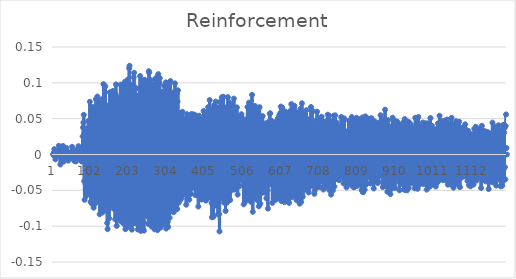
| Category | Reinforcement |
|---|---|
| 0 | 0 |
| 1 | 0.002 |
| 2 | -0.001 |
| 3 | 0.007 |
| 4 | -0.002 |
| 5 | 0 |
| 6 | -0.007 |
| 7 | 0.005 |
| 8 | 0.005 |
| 9 | 0.004 |
| 10 | 0.003 |
| 11 | 0.001 |
| 12 | 0.003 |
| 13 | 0.005 |
| 14 | 0.001 |
| 15 | 0.012 |
| 16 | -0.001 |
| 17 | -0.002 |
| 18 | 0.006 |
| 19 | -0.014 |
| 20 | -0.005 |
| 21 | 0.003 |
| 22 | -0.01 |
| 23 | -0.002 |
| 24 | 0.004 |
| 25 | -0.006 |
| 26 | 0.012 |
| 27 | 0.001 |
| 28 | -0.01 |
| 29 | 0.001 |
| 30 | -0.006 |
| 31 | 0.004 |
| 32 | -0.003 |
| 33 | 0.004 |
| 34 | -0.005 |
| 35 | 0.009 |
| 36 | -0.003 |
| 37 | -0.005 |
| 38 | 0.004 |
| 39 | 0.003 |
| 40 | -0.009 |
| 41 | 0.001 |
| 42 | -0.002 |
| 43 | 0.001 |
| 44 | 0.002 |
| 45 | -0.005 |
| 46 | -0.005 |
| 47 | 0 |
| 48 | 0 |
| 49 | 0.003 |
| 50 | 0.011 |
| 51 | 0.006 |
| 52 | -0.004 |
| 53 | -0.004 |
| 54 | -0.005 |
| 55 | 0.003 |
| 56 | -0.009 |
| 57 | 0.006 |
| 58 | -0.003 |
| 59 | 0.004 |
| 60 | -0.01 |
| 61 | -0.002 |
| 62 | -0.004 |
| 63 | 0.002 |
| 64 | -0.003 |
| 65 | 0.004 |
| 66 | 0.001 |
| 67 | 0.012 |
| 68 | 0.009 |
| 69 | -0.002 |
| 70 | 0.006 |
| 71 | 0.004 |
| 72 | -0.001 |
| 73 | 0.005 |
| 74 | -0.008 |
| 75 | -0.01 |
| 76 | -0.009 |
| 77 | 0.004 |
| 78 | 0.025 |
| 79 | 0.038 |
| 80 | 0.045 |
| 81 | 0.055 |
| 82 | -0.037 |
| 83 | -0.063 |
| 84 | 0.009 |
| 85 | 0.03 |
| 86 | -0.042 |
| 87 | -0.058 |
| 88 | 0.012 |
| 89 | 0.036 |
| 90 | -0.04 |
| 91 | -0.052 |
| 92 | 0.019 |
| 93 | 0.047 |
| 94 | -0.035 |
| 95 | -0.054 |
| 96 | 0.03 |
| 97 | 0.074 |
| 98 | -0.029 |
| 99 | -0.066 |
| 100 | 0.003 |
| 101 | 0.062 |
| 102 | 0.061 |
| 103 | -0.069 |
| 104 | -0.022 |
| 105 | 0.066 |
| 106 | 0.046 |
| 107 | -0.074 |
| 108 | -0.044 |
| 109 | 0.056 |
| 110 | 0.03 |
| 111 | -0.069 |
| 112 | -0.039 |
| 113 | 0.077 |
| 114 | 0.021 |
| 115 | -0.066 |
| 116 | -0.051 |
| 117 | 0.081 |
| 118 | 0.034 |
| 119 | -0.064 |
| 120 | -0.028 |
| 121 | 0.075 |
| 122 | 0.033 |
| 123 | -0.083 |
| 124 | -0.065 |
| 125 | 0.07 |
| 126 | 0.074 |
| 127 | -0.078 |
| 128 | -0.079 |
| 129 | 0.077 |
| 130 | 0.053 |
| 131 | -0.081 |
| 132 | -0.077 |
| 133 | 0.098 |
| 134 | 0.065 |
| 135 | -0.073 |
| 136 | -0.065 |
| 137 | 0.087 |
| 138 | 0.095 |
| 139 | -0.076 |
| 140 | 0.016 |
| 141 | 0.069 |
| 142 | 0.067 |
| 143 | -0.096 |
| 144 | -0.104 |
| 145 | 0.067 |
| 146 | 0.063 |
| 147 | -0.077 |
| 148 | -0.089 |
| 149 | 0.067 |
| 150 | 0.087 |
| 151 | -0.065 |
| 152 | -0.071 |
| 153 | 0.086 |
| 154 | -0.042 |
| 155 | -0.057 |
| 156 | -0.067 |
| 157 | 0.084 |
| 158 | 0.089 |
| 159 | -0.063 |
| 160 | -0.076 |
| 161 | 0.077 |
| 162 | 0.082 |
| 163 | -0.076 |
| 164 | -0.09 |
| 165 | 0.084 |
| 166 | 0.098 |
| 167 | -0.073 |
| 168 | -0.1 |
| 169 | 0.065 |
| 170 | 0.079 |
| 171 | -0.083 |
| 172 | -0.079 |
| 173 | 0.068 |
| 174 | 0.077 |
| 175 | -0.084 |
| 176 | -0.091 |
| 177 | 0.079 |
| 178 | 0.097 |
| 179 | -0.082 |
| 180 | -0.094 |
| 181 | 0.06 |
| 182 | 0.097 |
| 183 | -0.077 |
| 184 | -0.087 |
| 185 | 0.078 |
| 186 | 0.094 |
| 187 | -0.097 |
| 188 | -0.095 |
| 189 | 0.081 |
| 190 | 0.102 |
| 191 | -0.104 |
| 192 | -0.086 |
| 193 | 0.064 |
| 194 | 0.08 |
| 195 | -0.102 |
| 196 | -0.1 |
| 197 | 0.074 |
| 198 | 0.105 |
| 199 | -0.092 |
| 200 | -0.095 |
| 201 | 0.12 |
| 202 | 0.124 |
| 203 | -0.07 |
| 204 | -0.094 |
| 205 | 0.07 |
| 206 | 0.094 |
| 207 | -0.098 |
| 208 | -0.105 |
| 209 | 0.096 |
| 210 | 0.098 |
| 211 | -0.085 |
| 212 | -0.096 |
| 213 | 0.108 |
| 214 | 0.114 |
| 215 | -0.066 |
| 216 | -0.084 |
| 217 | 0.08 |
| 218 | 0.093 |
| 219 | -0.085 |
| 220 | -0.093 |
| 221 | 0.058 |
| 222 | 0.063 |
| 223 | -0.098 |
| 224 | -0.105 |
| 225 | 0.067 |
| 226 | 0.082 |
| 227 | -0.086 |
| 228 | -0.091 |
| 229 | 0.091 |
| 230 | 0.109 |
| 231 | -0.078 |
| 232 | -0.107 |
| 233 | 0.092 |
| 234 | 0.094 |
| 235 | -0.084 |
| 236 | -0.092 |
| 237 | 0.093 |
| 238 | 0.103 |
| 239 | -0.094 |
| 240 | -0.106 |
| 241 | 0.084 |
| 242 | 0.104 |
| 243 | -0.084 |
| 244 | -0.077 |
| 245 | 0.094 |
| 246 | 0.1 |
| 247 | -0.081 |
| 248 | -0.086 |
| 249 | 0.102 |
| 250 | 0.094 |
| 251 | -0.074 |
| 252 | -0.097 |
| 253 | 0.116 |
| 254 | 0.114 |
| 255 | -0.077 |
| 256 | -0.095 |
| 257 | 0.104 |
| 258 | 0.103 |
| 259 | -0.089 |
| 260 | -0.1 |
| 261 | 0.089 |
| 262 | 0.097 |
| 263 | -0.089 |
| 264 | -0.09 |
| 265 | 0.086 |
| 266 | 0.097 |
| 267 | -0.093 |
| 268 | -0.104 |
| 269 | 0.075 |
| 270 | 0.106 |
| 271 | -0.075 |
| 272 | -0.089 |
| 273 | 0.09 |
| 274 | 0.108 |
| 275 | -0.088 |
| 276 | -0.106 |
| 277 | 0.094 |
| 278 | 0.112 |
| 279 | -0.084 |
| 280 | -0.099 |
| 281 | 0.1 |
| 282 | 0.107 |
| 283 | -0.081 |
| 284 | -0.102 |
| 285 | 0.068 |
| 286 | 0.087 |
| 287 | -0.098 |
| 288 | -0.093 |
| 289 | 0.081 |
| 290 | 0.087 |
| 291 | -0.091 |
| 292 | -0.095 |
| 293 | 0.078 |
| 294 | 0.096 |
| 295 | -0.088 |
| 296 | -0.094 |
| 297 | 0.076 |
| 298 | 0.101 |
| 299 | -0.103 |
| 300 | -0.095 |
| 301 | 0.077 |
| 302 | 0.1 |
| 303 | -0.094 |
| 304 | -0.101 |
| 305 | 0.079 |
| 306 | 0.095 |
| 307 | -0.077 |
| 308 | -0.088 |
| 309 | 0.073 |
| 310 | 0.103 |
| 311 | -0.075 |
| 312 | -0.079 |
| 313 | 0.059 |
| 314 | 0.076 |
| 315 | -0.071 |
| 316 | -0.072 |
| 317 | 0.062 |
| 318 | 0.086 |
| 319 | -0.08 |
| 320 | -0.074 |
| 321 | 0.057 |
| 322 | 0.099 |
| 323 | -0.066 |
| 324 | -0.066 |
| 325 | 0.067 |
| 326 | 0.085 |
| 327 | -0.061 |
| 328 | -0.076 |
| 329 | 0.074 |
| 330 | 0.09 |
| 331 | -0.048 |
| 332 | -0.067 |
| 333 | 0.051 |
| 334 | 0.056 |
| 335 | -0.056 |
| 336 | -0.064 |
| 337 | 0.058 |
| 338 | 0.053 |
| 339 | -0.061 |
| 340 | -0.057 |
| 341 | 0.03 |
| 342 | 0.06 |
| 343 | -0.05 |
| 344 | -0.056 |
| 345 | 0.037 |
| 346 | 0.042 |
| 347 | -0.037 |
| 348 | -0.048 |
| 349 | 0.046 |
| 350 | 0.051 |
| 351 | -0.053 |
| 352 | -0.07 |
| 353 | 0.046 |
| 354 | 0.056 |
| 355 | -0.05 |
| 356 | -0.057 |
| 357 | 0.045 |
| 358 | 0.046 |
| 359 | -0.051 |
| 360 | -0.063 |
| 361 | 0.029 |
| 362 | 0.039 |
| 363 | -0.044 |
| 364 | -0.055 |
| 365 | 0.051 |
| 366 | 0.057 |
| 367 | -0.018 |
| 368 | -0.046 |
| 369 | 0.055 |
| 370 | 0.056 |
| 371 | -0.023 |
| 372 | -0.046 |
| 373 | 0.046 |
| 374 | 0.056 |
| 375 | -0.026 |
| 376 | -0.057 |
| 377 | 0.037 |
| 378 | 0.054 |
| 379 | -0.036 |
| 380 | -0.056 |
| 381 | 0.041 |
| 382 | 0.032 |
| 383 | -0.038 |
| 384 | -0.073 |
| 385 | 0.05 |
| 386 | 0.054 |
| 387 | -0.051 |
| 388 | -0.059 |
| 389 | 0.044 |
| 390 | 0.047 |
| 391 | -0.043 |
| 392 | -0.063 |
| 393 | 0.029 |
| 394 | 0.029 |
| 395 | -0.056 |
| 396 | -0.062 |
| 397 | 0.05 |
| 398 | 0.061 |
| 399 | -0.046 |
| 400 | -0.054 |
| 401 | 0.043 |
| 402 | 0.058 |
| 403 | -0.035 |
| 404 | -0.064 |
| 405 | 0.025 |
| 406 | 0.049 |
| 407 | -0.051 |
| 408 | -0.061 |
| 409 | 0.043 |
| 410 | 0.066 |
| 411 | -0.045 |
| 412 | -0.06 |
| 413 | 0.058 |
| 414 | 0.076 |
| 415 | -0.034 |
| 416 | -0.056 |
| 417 | 0.055 |
| 418 | 0.059 |
| 419 | -0.068 |
| 420 | -0.088 |
| 421 | 0.043 |
| 422 | 0.063 |
| 423 | -0.06 |
| 424 | -0.087 |
| 425 | 0.053 |
| 426 | 0.069 |
| 427 | -0.052 |
| 428 | -0.071 |
| 429 | 0.05 |
| 430 | 0.074 |
| 431 | -0.034 |
| 432 | -0.066 |
| 433 | 0.052 |
| 434 | 0.065 |
| 435 | -0.056 |
| 436 | -0.083 |
| 437 | 0.045 |
| 438 | 0.057 |
| 439 | -0.083 |
| 440 | -0.107 |
| 441 | 0.062 |
| 442 | 0.074 |
| 443 | -0.048 |
| 444 | -0.05 |
| 445 | 0.071 |
| 446 | 0.08 |
| 447 | -0.036 |
| 448 | -0.061 |
| 449 | 0.056 |
| 450 | 0.08 |
| 451 | -0.045 |
| 452 | -0.067 |
| 453 | 0.054 |
| 454 | 0.061 |
| 455 | -0.052 |
| 456 | -0.079 |
| 457 | 0.037 |
| 458 | 0.066 |
| 459 | -0.055 |
| 460 | -0.067 |
| 461 | 0.049 |
| 462 | 0.08 |
| 463 | -0.054 |
| 464 | -0.056 |
| 465 | 0.052 |
| 466 | 0.073 |
| 467 | -0.044 |
| 468 | -0.064 |
| 469 | 0.044 |
| 470 | 0.068 |
| 471 | -0.039 |
| 472 | -0.05 |
| 473 | 0.042 |
| 474 | 0.07 |
| 475 | -0.042 |
| 476 | -0.038 |
| 477 | 0.062 |
| 478 | 0.078 |
| 479 | -0.049 |
| 480 | -0.048 |
| 481 | 0.042 |
| 482 | 0.048 |
| 483 | -0.038 |
| 484 | -0.046 |
| 485 | 0.049 |
| 486 | 0.066 |
| 487 | -0.043 |
| 488 | -0.056 |
| 489 | 0.03 |
| 490 | 0.042 |
| 491 | -0.044 |
| 492 | -0.044 |
| 493 | 0.027 |
| 494 | 0.053 |
| 495 | -0.016 |
| 496 | -0.035 |
| 497 | 0.054 |
| 498 | 0.056 |
| 499 | -0.025 |
| 500 | -0.029 |
| 501 | 0.047 |
| 502 | 0.046 |
| 503 | -0.043 |
| 504 | -0.07 |
| 505 | 0.032 |
| 506 | 0.049 |
| 507 | -0.061 |
| 508 | -0.066 |
| 509 | 0.03 |
| 510 | 0.04 |
| 511 | -0.046 |
| 512 | -0.046 |
| 513 | 0.046 |
| 514 | 0.066 |
| 515 | -0.052 |
| 516 | -0.058 |
| 517 | 0.045 |
| 518 | 0.072 |
| 519 | -0.047 |
| 520 | -0.063 |
| 521 | 0.058 |
| 522 | 0.063 |
| 523 | -0.054 |
| 524 | -0.067 |
| 525 | 0.06 |
| 526 | 0.083 |
| 527 | -0.063 |
| 528 | -0.08 |
| 529 | 0.048 |
| 530 | 0.062 |
| 531 | -0.043 |
| 532 | -0.06 |
| 533 | 0.059 |
| 534 | 0.068 |
| 535 | -0.034 |
| 536 | -0.046 |
| 537 | 0.057 |
| 538 | 0.064 |
| 539 | -0.042 |
| 540 | -0.064 |
| 541 | 0.048 |
| 542 | 0.049 |
| 543 | -0.051 |
| 544 | -0.072 |
| 545 | 0.047 |
| 546 | 0.066 |
| 547 | -0.044 |
| 548 | -0.069 |
| 549 | 0.046 |
| 550 | 0.046 |
| 551 | -0.028 |
| 552 | -0.054 |
| 553 | 0.042 |
| 554 | 0.054 |
| 555 | -0.03 |
| 556 | -0.053 |
| 557 | 0.035 |
| 558 | 0.042 |
| 559 | -0.032 |
| 560 | -0.05 |
| 561 | 0.043 |
| 562 | 0.043 |
| 563 | -0.044 |
| 564 | -0.061 |
| 565 | 0.033 |
| 566 | 0.044 |
| 567 | -0.05 |
| 568 | -0.075 |
| 569 | 0.034 |
| 570 | 0.045 |
| 571 | -0.027 |
| 572 | -0.042 |
| 573 | 0.057 |
| 574 | 0.058 |
| 575 | -0.014 |
| 576 | -0.03 |
| 577 | 0.038 |
| 578 | 0.047 |
| 579 | -0.04 |
| 580 | -0.067 |
| 581 | 0.027 |
| 582 | 0.041 |
| 583 | -0.042 |
| 584 | -0.06 |
| 585 | 0.043 |
| 586 | 0.033 |
| 587 | -0.04 |
| 588 | -0.063 |
| 589 | 0.043 |
| 590 | 0.045 |
| 591 | -0.036 |
| 592 | -0.05 |
| 593 | 0.048 |
| 594 | 0.05 |
| 595 | -0.035 |
| 596 | -0.061 |
| 597 | 0.038 |
| 598 | 0.055 |
| 599 | -0.034 |
| 600 | -0.062 |
| 601 | 0.058 |
| 602 | 0.067 |
| 603 | -0.044 |
| 604 | -0.065 |
| 605 | 0.041 |
| 606 | 0.065 |
| 607 | -0.046 |
| 608 | -0.059 |
| 609 | 0.049 |
| 610 | 0.06 |
| 611 | -0.053 |
| 612 | -0.066 |
| 613 | 0.051 |
| 614 | 0.06 |
| 615 | -0.053 |
| 616 | -0.059 |
| 617 | 0.037 |
| 618 | 0.053 |
| 619 | -0.041 |
| 620 | -0.065 |
| 621 | 0.047 |
| 622 | 0.056 |
| 623 | -0.057 |
| 624 | -0.068 |
| 625 | 0.041 |
| 626 | 0.06 |
| 627 | -0.052 |
| 628 | -0.058 |
| 629 | 0.038 |
| 630 | 0.07 |
| 631 | -0.042 |
| 632 | -0.06 |
| 633 | 0.039 |
| 634 | 0.064 |
| 635 | -0.036 |
| 636 | -0.057 |
| 637 | 0.065 |
| 638 | 0.068 |
| 639 | -0.036 |
| 640 | -0.055 |
| 641 | 0.039 |
| 642 | 0.059 |
| 643 | -0.058 |
| 644 | -0.064 |
| 645 | 0.035 |
| 646 | 0.053 |
| 647 | -0.055 |
| 648 | -0.059 |
| 649 | 0.05 |
| 650 | 0.059 |
| 651 | -0.056 |
| 652 | -0.069 |
| 653 | 0.052 |
| 654 | 0.064 |
| 655 | -0.054 |
| 656 | -0.066 |
| 657 | 0.059 |
| 658 | 0.071 |
| 659 | -0.055 |
| 660 | -0.059 |
| 661 | 0.052 |
| 662 | 0.057 |
| 663 | -0.042 |
| 664 | -0.049 |
| 665 | 0.042 |
| 666 | 0.048 |
| 667 | -0.039 |
| 668 | -0.044 |
| 669 | 0.038 |
| 670 | 0.062 |
| 671 | -0.049 |
| 672 | -0.047 |
| 673 | 0.047 |
| 674 | 0.049 |
| 675 | -0.047 |
| 676 | -0.053 |
| 677 | 0.027 |
| 678 | 0.047 |
| 679 | -0.032 |
| 680 | -0.029 |
| 681 | 0.04 |
| 682 | 0.066 |
| 683 | -0.044 |
| 684 | -0.032 |
| 685 | 0.061 |
| 686 | 0.06 |
| 687 | -0.042 |
| 688 | -0.043 |
| 689 | 0.032 |
| 690 | 0.033 |
| 691 | -0.055 |
| 692 | -0.05 |
| 693 | 0.024 |
| 694 | 0.047 |
| 695 | -0.047 |
| 696 | -0.036 |
| 697 | 0.037 |
| 698 | 0.06 |
| 699 | -0.035 |
| 700 | -0.032 |
| 701 | 0.032 |
| 702 | 0.049 |
| 703 | -0.035 |
| 704 | -0.046 |
| 705 | 0.031 |
| 706 | 0.044 |
| 707 | -0.035 |
| 708 | -0.029 |
| 709 | 0.022 |
| 710 | 0.053 |
| 711 | -0.037 |
| 712 | -0.036 |
| 713 | 0.016 |
| 714 | 0.046 |
| 715 | -0.049 |
| 716 | -0.044 |
| 717 | 0.019 |
| 718 | 0.041 |
| 719 | -0.037 |
| 720 | -0.041 |
| 721 | 0.019 |
| 722 | 0.046 |
| 723 | -0.032 |
| 724 | -0.029 |
| 725 | 0.033 |
| 726 | 0.056 |
| 727 | -0.039 |
| 728 | -0.047 |
| 729 | 0.04 |
| 730 | 0.054 |
| 731 | -0.05 |
| 732 | -0.048 |
| 733 | 0.022 |
| 734 | 0.037 |
| 735 | -0.056 |
| 736 | -0.042 |
| 737 | 0.024 |
| 738 | 0.046 |
| 739 | -0.043 |
| 740 | -0.05 |
| 741 | 0.03 |
| 742 | 0.054 |
| 743 | -0.028 |
| 744 | -0.045 |
| 745 | 0.042 |
| 746 | 0.055 |
| 747 | -0.031 |
| 748 | -0.034 |
| 749 | 0.034 |
| 750 | 0.045 |
| 751 | -0.031 |
| 752 | -0.03 |
| 753 | 0.04 |
| 754 | 0.036 |
| 755 | -0.031 |
| 756 | -0.036 |
| 757 | 0.015 |
| 758 | 0.029 |
| 759 | -0.022 |
| 760 | -0.026 |
| 761 | 0.021 |
| 762 | 0.052 |
| 763 | -0.023 |
| 764 | -0.03 |
| 765 | 0.032 |
| 766 | 0.048 |
| 767 | -0.026 |
| 768 | -0.04 |
| 769 | 0.019 |
| 770 | 0.05 |
| 771 | -0.023 |
| 772 | -0.024 |
| 773 | 0.029 |
| 774 | 0.032 |
| 775 | -0.039 |
| 776 | -0.046 |
| 777 | 0.02 |
| 778 | 0.032 |
| 779 | -0.04 |
| 780 | -0.041 |
| 781 | 0.018 |
| 782 | 0.047 |
| 783 | -0.041 |
| 784 | -0.04 |
| 785 | 0.037 |
| 786 | 0.045 |
| 787 | -0.04 |
| 788 | -0.038 |
| 789 | 0.031 |
| 790 | 0.052 |
| 791 | -0.033 |
| 792 | -0.045 |
| 793 | 0.027 |
| 794 | 0.048 |
| 795 | -0.045 |
| 796 | -0.046 |
| 797 | 0.016 |
| 798 | 0.048 |
| 799 | -0.028 |
| 800 | -0.043 |
| 801 | 0.038 |
| 802 | 0.051 |
| 803 | -0.03 |
| 804 | -0.044 |
| 805 | 0.03 |
| 806 | 0.05 |
| 807 | -0.038 |
| 808 | -0.036 |
| 809 | 0.042 |
| 810 | 0.046 |
| 811 | -0.032 |
| 812 | -0.04 |
| 813 | 0.023 |
| 814 | 0.048 |
| 815 | -0.043 |
| 816 | -0.05 |
| 817 | 0.031 |
| 818 | 0.052 |
| 819 | -0.052 |
| 820 | -0.053 |
| 821 | 0.032 |
| 822 | 0.051 |
| 823 | -0.043 |
| 824 | -0.049 |
| 825 | 0.032 |
| 826 | 0.053 |
| 827 | -0.025 |
| 828 | -0.042 |
| 829 | 0.036 |
| 830 | 0.051 |
| 831 | -0.023 |
| 832 | -0.026 |
| 833 | 0.029 |
| 834 | 0.05 |
| 835 | -0.032 |
| 836 | -0.026 |
| 837 | 0.024 |
| 838 | 0.036 |
| 839 | -0.04 |
| 840 | -0.04 |
| 841 | 0.026 |
| 842 | 0.051 |
| 843 | -0.026 |
| 844 | -0.032 |
| 845 | 0.017 |
| 846 | 0.032 |
| 847 | -0.039 |
| 848 | -0.047 |
| 849 | 0.017 |
| 850 | 0.046 |
| 851 | -0.036 |
| 852 | -0.037 |
| 853 | 0.033 |
| 854 | 0.044 |
| 855 | -0.034 |
| 856 | -0.036 |
| 857 | 0.028 |
| 858 | 0.039 |
| 859 | -0.04 |
| 860 | -0.037 |
| 861 | 0.023 |
| 862 | 0.044 |
| 863 | -0.013 |
| 864 | -0.029 |
| 865 | 0.041 |
| 866 | 0.055 |
| 867 | -0.017 |
| 868 | -0.019 |
| 869 | 0.041 |
| 870 | 0.048 |
| 871 | -0.031 |
| 872 | -0.045 |
| 873 | 0.025 |
| 874 | 0.035 |
| 875 | -0.033 |
| 876 | -0.044 |
| 877 | 0.031 |
| 878 | 0.062 |
| 879 | -0.031 |
| 880 | -0.032 |
| 881 | 0.036 |
| 882 | 0.044 |
| 883 | -0.044 |
| 884 | -0.052 |
| 885 | 0.024 |
| 886 | 0.048 |
| 887 | -0.023 |
| 888 | -0.045 |
| 889 | 0.028 |
| 890 | 0.039 |
| 891 | -0.05 |
| 892 | -0.055 |
| 893 | 0.036 |
| 894 | 0.037 |
| 895 | -0.043 |
| 896 | -0.047 |
| 897 | 0.034 |
| 898 | 0.051 |
| 899 | -0.029 |
| 900 | -0.041 |
| 901 | 0.034 |
| 902 | 0.045 |
| 903 | -0.029 |
| 904 | -0.047 |
| 905 | 0.019 |
| 906 | 0.046 |
| 907 | -0.032 |
| 908 | -0.032 |
| 909 | 0.031 |
| 910 | 0.046 |
| 911 | -0.02 |
| 912 | -0.031 |
| 913 | 0.035 |
| 914 | 0.042 |
| 915 | -0.038 |
| 916 | -0.05 |
| 917 | 0.021 |
| 918 | 0.038 |
| 919 | -0.028 |
| 920 | -0.034 |
| 921 | 0.033 |
| 922 | 0.039 |
| 923 | -0.037 |
| 924 | -0.041 |
| 925 | 0.027 |
| 926 | 0.045 |
| 927 | -0.029 |
| 928 | -0.049 |
| 929 | 0.024 |
| 930 | 0.049 |
| 931 | -0.05 |
| 932 | -0.046 |
| 933 | 0.025 |
| 934 | 0.032 |
| 935 | -0.033 |
| 936 | -0.05 |
| 937 | 0.022 |
| 938 | 0.046 |
| 939 | -0.032 |
| 940 | -0.047 |
| 941 | 0.036 |
| 942 | 0.045 |
| 943 | -0.03 |
| 944 | -0.038 |
| 945 | 0.032 |
| 946 | 0.042 |
| 947 | -0.028 |
| 948 | -0.04 |
| 949 | 0.035 |
| 950 | 0.034 |
| 951 | -0.025 |
| 952 | -0.031 |
| 953 | 0.024 |
| 954 | 0.036 |
| 955 | -0.033 |
| 956 | -0.047 |
| 957 | 0.028 |
| 958 | 0.051 |
| 959 | -0.023 |
| 960 | -0.029 |
| 961 | 0.027 |
| 962 | 0.029 |
| 963 | -0.027 |
| 964 | -0.048 |
| 965 | 0.032 |
| 966 | 0.052 |
| 967 | -0.034 |
| 968 | -0.043 |
| 969 | 0.025 |
| 970 | 0.039 |
| 971 | -0.036 |
| 972 | -0.04 |
| 973 | 0.014 |
| 974 | 0.039 |
| 975 | -0.029 |
| 976 | -0.038 |
| 977 | 0.02 |
| 978 | 0.045 |
| 979 | -0.04 |
| 980 | -0.041 |
| 981 | 0.023 |
| 982 | 0.043 |
| 983 | -0.027 |
| 984 | -0.033 |
| 985 | 0.026 |
| 986 | 0.044 |
| 987 | -0.026 |
| 988 | -0.049 |
| 989 | 0.022 |
| 990 | 0.043 |
| 991 | -0.033 |
| 992 | -0.046 |
| 993 | 0.025 |
| 994 | 0.044 |
| 995 | -0.032 |
| 996 | -0.045 |
| 997 | 0.036 |
| 998 | 0.051 |
| 999 | -0.036 |
| 1000 | -0.036 |
| 1001 | 0.03 |
| 1002 | 0.04 |
| 1003 | -0.042 |
| 1004 | -0.031 |
| 1005 | 0.023 |
| 1006 | 0.032 |
| 1007 | -0.031 |
| 1008 | -0.036 |
| 1009 | 0.025 |
| 1010 | 0.034 |
| 1011 | -0.042 |
| 1012 | -0.045 |
| 1013 | 0.018 |
| 1014 | 0.036 |
| 1015 | -0.03 |
| 1016 | -0.039 |
| 1017 | 0.028 |
| 1018 | 0.043 |
| 1019 | -0.029 |
| 1020 | -0.037 |
| 1021 | 0.031 |
| 1022 | 0.054 |
| 1023 | -0.021 |
| 1024 | -0.027 |
| 1025 | 0.035 |
| 1026 | 0.042 |
| 1027 | -0.03 |
| 1028 | -0.03 |
| 1029 | 0.031 |
| 1030 | 0.047 |
| 1031 | -0.036 |
| 1032 | -0.035 |
| 1033 | 0.023 |
| 1034 | 0.042 |
| 1035 | -0.031 |
| 1036 | -0.023 |
| 1037 | 0.011 |
| 1038 | 0.048 |
| 1039 | -0.025 |
| 1040 | -0.036 |
| 1041 | 0.032 |
| 1042 | 0.049 |
| 1043 | -0.034 |
| 1044 | -0.042 |
| 1045 | 0.023 |
| 1046 | 0.042 |
| 1047 | -0.027 |
| 1048 | -0.031 |
| 1049 | 0.024 |
| 1050 | 0.043 |
| 1051 | -0.032 |
| 1052 | -0.042 |
| 1053 | 0.028 |
| 1054 | 0.051 |
| 1055 | -0.022 |
| 1056 | -0.03 |
| 1057 | 0.018 |
| 1058 | 0.041 |
| 1059 | -0.046 |
| 1060 | -0.031 |
| 1061 | 0.024 |
| 1062 | 0.039 |
| 1063 | -0.038 |
| 1064 | -0.035 |
| 1065 | 0.02 |
| 1066 | 0.046 |
| 1067 | -0.024 |
| 1068 | -0.041 |
| 1069 | 0.029 |
| 1070 | 0.036 |
| 1071 | -0.037 |
| 1072 | -0.028 |
| 1073 | 0.018 |
| 1074 | 0.046 |
| 1075 | -0.03 |
| 1076 | -0.046 |
| 1077 | 0.018 |
| 1078 | 0.037 |
| 1079 | -0.019 |
| 1080 | -0.032 |
| 1081 | 0.02 |
| 1082 | 0.034 |
| 1083 | -0.028 |
| 1084 | -0.03 |
| 1085 | 0.016 |
| 1086 | 0.038 |
| 1087 | -0.03 |
| 1088 | -0.023 |
| 1089 | 0.013 |
| 1090 | 0.042 |
| 1091 | -0.013 |
| 1092 | -0.026 |
| 1093 | 0.028 |
| 1094 | 0.034 |
| 1095 | -0.023 |
| 1096 | -0.037 |
| 1097 | 0.02 |
| 1098 | 0.033 |
| 1099 | -0.018 |
| 1100 | -0.043 |
| 1101 | 0.004 |
| 1102 | 0.029 |
| 1103 | -0.031 |
| 1104 | -0.044 |
| 1105 | 0.023 |
| 1106 | 0.027 |
| 1107 | -0.023 |
| 1108 | -0.034 |
| 1109 | 0.016 |
| 1110 | 0.028 |
| 1111 | -0.032 |
| 1112 | -0.042 |
| 1113 | 0.027 |
| 1114 | 0.036 |
| 1115 | -0.016 |
| 1116 | -0.028 |
| 1117 | 0.025 |
| 1118 | 0.039 |
| 1119 | -0.016 |
| 1120 | -0.036 |
| 1121 | 0.019 |
| 1122 | 0.033 |
| 1123 | -0.013 |
| 1124 | -0.027 |
| 1125 | 0.022 |
| 1126 | 0.018 |
| 1127 | -0.024 |
| 1128 | -0.031 |
| 1129 | 0.034 |
| 1130 | 0.036 |
| 1131 | -0.016 |
| 1132 | -0.047 |
| 1133 | 0.016 |
| 1134 | 0.04 |
| 1135 | -0.026 |
| 1136 | -0.035 |
| 1137 | 0.027 |
| 1138 | 0.027 |
| 1139 | -0.016 |
| 1140 | -0.035 |
| 1141 | 0.033 |
| 1142 | 0.024 |
| 1143 | -0.024 |
| 1144 | -0.038 |
| 1145 | 0.026 |
| 1146 | 0.03 |
| 1147 | -0.015 |
| 1148 | -0.031 |
| 1149 | 0.031 |
| 1150 | 0.026 |
| 1151 | -0.019 |
| 1152 | -0.048 |
| 1153 | 0.029 |
| 1154 | 0.027 |
| 1155 | -0.009 |
| 1156 | -0.032 |
| 1157 | 0.022 |
| 1158 | 0.024 |
| 1159 | -0.023 |
| 1160 | -0.038 |
| 1161 | 0.027 |
| 1162 | 0.045 |
| 1163 | -0.008 |
| 1164 | -0.039 |
| 1165 | 0.033 |
| 1166 | 0.04 |
| 1167 | -0.023 |
| 1168 | -0.039 |
| 1169 | 0.029 |
| 1170 | 0.036 |
| 1171 | -0.009 |
| 1172 | -0.043 |
| 1173 | 0.027 |
| 1174 | 0.031 |
| 1175 | -0.018 |
| 1176 | -0.035 |
| 1177 | 0.036 |
| 1178 | 0.041 |
| 1179 | -0.022 |
| 1180 | -0.033 |
| 1181 | 0.029 |
| 1182 | 0.033 |
| 1183 | -0.025 |
| 1184 | -0.044 |
| 1185 | 0.01 |
| 1186 | 0.029 |
| 1187 | -0.04 |
| 1188 | -0.044 |
| 1189 | 0.012 |
| 1190 | 0.041 |
| 1191 | -0.021 |
| 1192 | -0.036 |
| 1193 | 0.03 |
| 1194 | 0.037 |
| 1195 | -0.018 |
| 1196 | -0.035 |
| 1197 | 0.04 |
| 1198 | 0.056 |
| 1199 | 0.009 |
| 1200 | 0 |